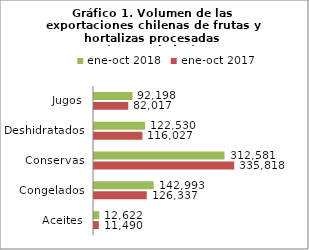
| Category | ene-oct 2017 | ene-oct 2018 |
|---|---|---|
| Aceites | 11490446.983 | 12621599.469 |
| Congelados | 126337298.826 | 142993453.8 |
| Conservas | 335817636.795 | 312580781.552 |
| Deshidratados | 116026733.704 | 122530399.737 |
| Jugos | 82017443.63 | 92198357.942 |